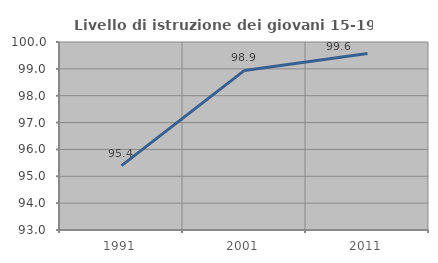
| Category | Livello di istruzione dei giovani 15-19 anni |
|---|---|
| 1991.0 | 95.397 |
| 2001.0 | 98.942 |
| 2011.0 | 99.573 |